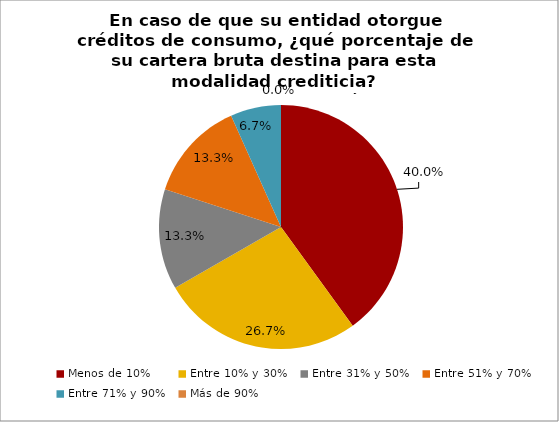
| Category | En caso de que su entidad otorgue créditos de consumo, ¿qué porcentaje de su cartera bruta destina para esta modalidad crediticia? Mercado de microcrédito |
|---|---|
| Menos de 10% | 0.4 |
| Entre 10% y 30% | 0.267 |
| Entre 31% y 50% | 0.133 |
| Entre 51% y 70% | 0.133 |
| Entre 71% y 90% | 0.067 |
| Más de 90% | 0 |